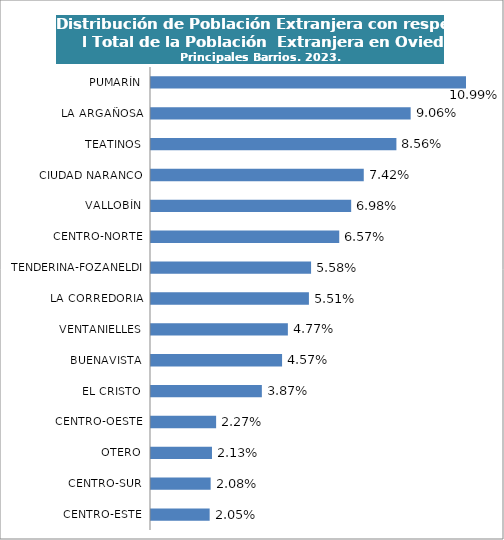
| Category | Series 0 |
|---|---|
| CENTRO-ESTE | 0.02 |
| CENTRO-SUR | 0.021 |
| OTERO | 0.021 |
| CENTRO-OESTE | 0.023 |
| EL CRISTO | 0.039 |
| BUENAVISTA | 0.046 |
| VENTANIELLES | 0.048 |
| LA CORREDORIA | 0.055 |
| TENDERINA-FOZANELDI | 0.056 |
| CENTRO-NORTE | 0.066 |
| VALLOBÍN | 0.07 |
| CIUDAD NARANCO | 0.074 |
| TEATINOS | 0.086 |
| LA ARGAÑOSA | 0.091 |
| PUMARÍN | 0.11 |